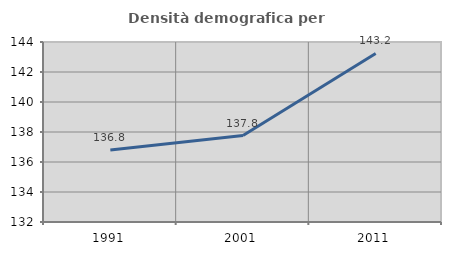
| Category | Densità demografica |
|---|---|
| 1991.0 | 136.797 |
| 2001.0 | 137.764 |
| 2011.0 | 143.237 |